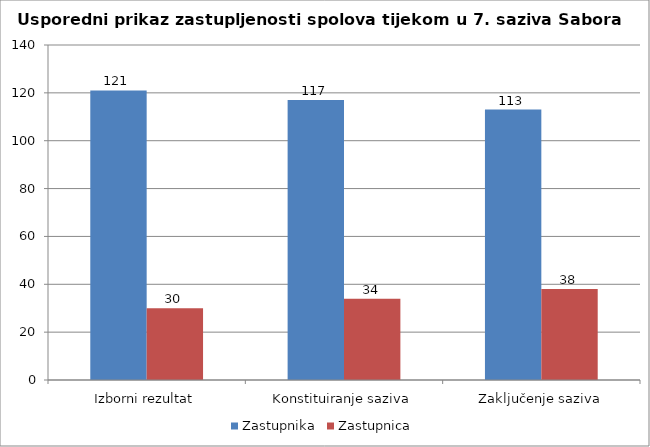
| Category | Zastupnika | Zastupnica |
|---|---|---|
| Izborni rezultat | 121 | 30 |
| Konstituiranje saziva | 117 | 34 |
| Zaključenje saziva | 113 | 38 |